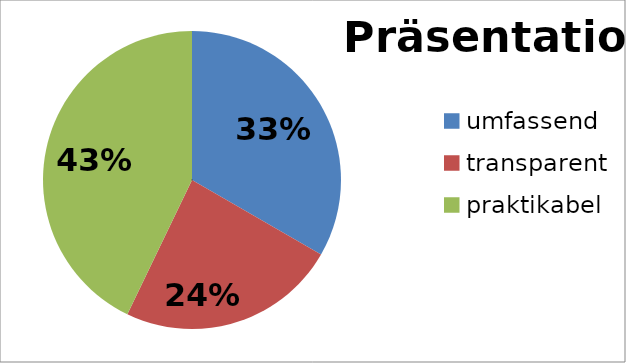
| Category | Präsentation |
|---|---|
| umfassend | 7 |
| transparent | 5 |
| praktikabel | 9 |